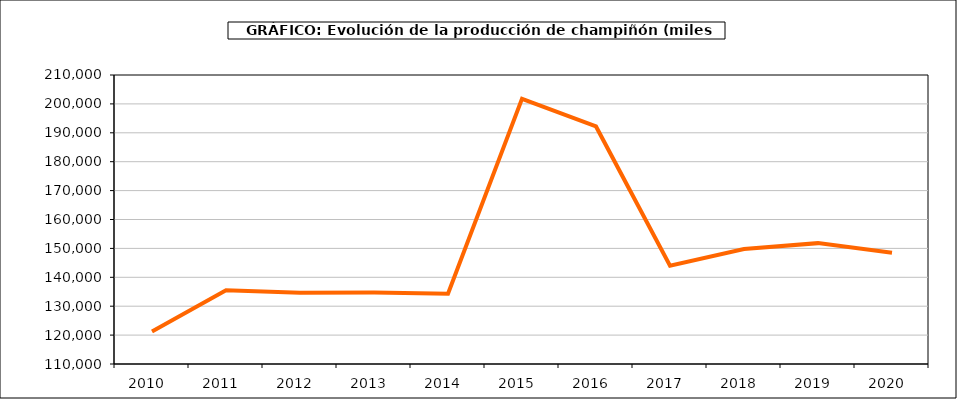
| Category | producción |
|---|---|
| 2010.0 | 121248 |
| 2011.0 | 135545 |
| 2012.0 | 134676 |
| 2013.0 | 134768 |
| 2014.0 | 134317 |
| 2015.0 | 201740 |
| 2016.0 | 192191 |
| 2017.0 | 144052 |
| 2018.0 | 149800 |
| 2019.0 | 151823 |
| 2020.0 | 148495 |